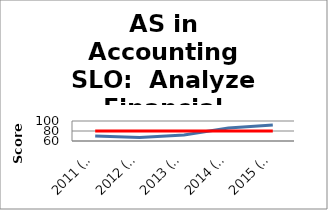
| Category | Avg Scores | Goal |
|---|---|---|
| 2011 (n=32) | 70 | 80 |
| 2012 (n=29) | 67 | 80 |
| 2013 (n=29) | 72 | 80 |
| 2014 (n=35) | 86 | 80 |
| 2015 (n=35) | 92 | 80 |